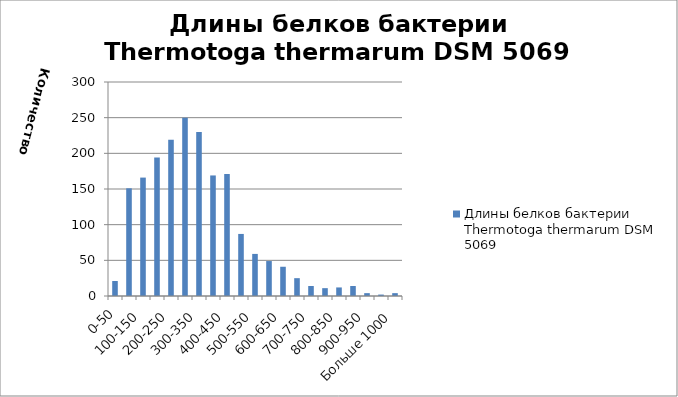
| Category | Длины белков бактерии Thermotoga thermarum DSM 5069 |
|---|---|
| 0-50 | 21 |
| 50-100 | 151 |
| 100-150 | 166 |
| 150-200 | 194 |
| 200-250 | 219 |
| 250-300 | 250 |
| 300-350 | 230 |
| 350-400 | 169 |
| 400-450 | 171 |
| 450-500 | 87 |
| 500-550 | 59 |
| 550-600 | 49 |
| 600-650 | 41 |
| 650-700 | 25 |
| 700-750 | 14 |
| 750-800 | 11 |
| 800-850 | 12 |
| 850-900 | 14 |
| 900-950 | 4 |
| 950-1000 | 2 |
| Больше 1000 | 4 |